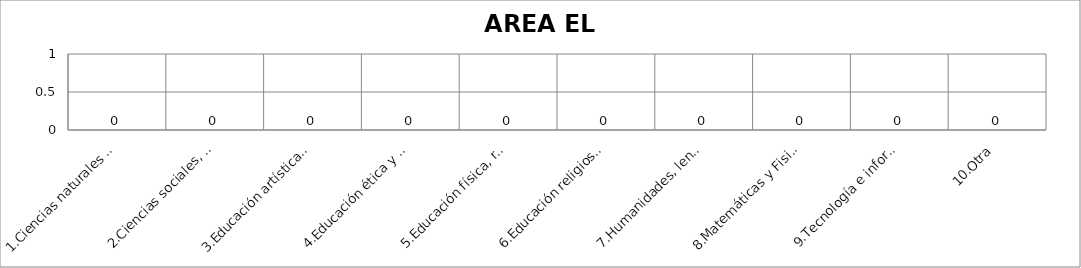
| Category | Series 0 |
|---|---|
| 1.Ciencias naturales y educación ambiental. | 0 |
| 2.Ciencias sociales, historia, geografía, constitución política y democracia. | 0 |
| 3.Educación artística y Cultural. | 0 |
| 4.Educación ética y en valores humanos.  | 0 |
| 5.Educación física, recreación y deportes.  | 0 |
| 6.Educación religiosa.  | 0 |
| 7.Humanidades, lengua castellana e idiomas extranjeros.  | 0 |
| 8.Matemáticas y Fisica | 0 |
| 9.Tecnología e informática | 0 |
| 10.Otra | 0 |